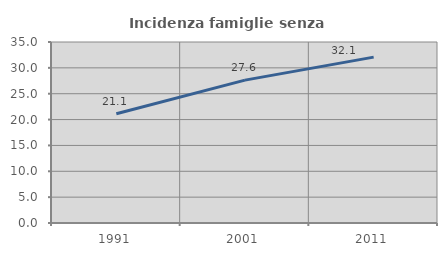
| Category | Incidenza famiglie senza nuclei |
|---|---|
| 1991.0 | 21.136 |
| 2001.0 | 27.63 |
| 2011.0 | 32.073 |